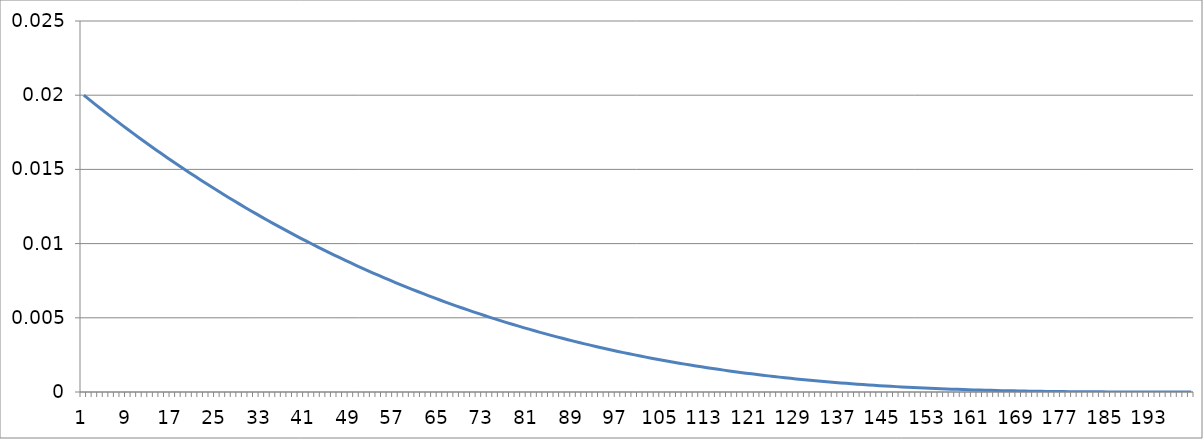
| Category | Series 0 |
|---|---|
| 0 | 0.02 |
| 1 | 0.02 |
| 2 | 0.019 |
| 3 | 0.019 |
| 4 | 0.019 |
| 5 | 0.019 |
| 6 | 0.018 |
| 7 | 0.018 |
| 8 | 0.018 |
| 9 | 0.017 |
| 10 | 0.017 |
| 11 | 0.017 |
| 12 | 0.017 |
| 13 | 0.016 |
| 14 | 0.016 |
| 15 | 0.016 |
| 16 | 0.016 |
| 17 | 0.015 |
| 18 | 0.015 |
| 19 | 0.015 |
| 20 | 0.015 |
| 21 | 0.014 |
| 22 | 0.014 |
| 23 | 0.014 |
| 24 | 0.014 |
| 25 | 0.013 |
| 26 | 0.013 |
| 27 | 0.013 |
| 28 | 0.013 |
| 29 | 0.012 |
| 30 | 0.012 |
| 31 | 0.012 |
| 32 | 0.012 |
| 33 | 0.012 |
| 34 | 0.011 |
| 35 | 0.011 |
| 36 | 0.011 |
| 37 | 0.011 |
| 38 | 0.011 |
| 39 | 0.01 |
| 40 | 0.01 |
| 41 | 0.01 |
| 42 | 0.01 |
| 43 | 0.01 |
| 44 | 0.009 |
| 45 | 0.009 |
| 46 | 0.009 |
| 47 | 0.009 |
| 48 | 0.009 |
| 49 | 0.009 |
| 50 | 0.008 |
| 51 | 0.008 |
| 52 | 0.008 |
| 53 | 0.008 |
| 54 | 0.008 |
| 55 | 0.008 |
| 56 | 0.007 |
| 57 | 0.007 |
| 58 | 0.007 |
| 59 | 0.007 |
| 60 | 0.007 |
| 61 | 0.007 |
| 62 | 0.006 |
| 63 | 0.006 |
| 64 | 0.006 |
| 65 | 0.006 |
| 66 | 0.006 |
| 67 | 0.006 |
| 68 | 0.006 |
| 69 | 0.006 |
| 70 | 0.005 |
| 71 | 0.005 |
| 72 | 0.005 |
| 73 | 0.005 |
| 74 | 0.005 |
| 75 | 0.005 |
| 76 | 0.005 |
| 77 | 0.005 |
| 78 | 0.004 |
| 79 | 0.004 |
| 80 | 0.004 |
| 81 | 0.004 |
| 82 | 0.004 |
| 83 | 0.004 |
| 84 | 0.004 |
| 85 | 0.004 |
| 86 | 0.004 |
| 87 | 0.004 |
| 88 | 0.003 |
| 89 | 0.003 |
| 90 | 0.003 |
| 91 | 0.003 |
| 92 | 0.003 |
| 93 | 0.003 |
| 94 | 0.003 |
| 95 | 0.003 |
| 96 | 0.003 |
| 97 | 0.003 |
| 98 | 0.003 |
| 99 | 0.002 |
| 100 | 0.002 |
| 101 | 0.002 |
| 102 | 0.002 |
| 103 | 0.002 |
| 104 | 0.002 |
| 105 | 0.002 |
| 106 | 0.002 |
| 107 | 0.002 |
| 108 | 0.002 |
| 109 | 0.002 |
| 110 | 0.002 |
| 111 | 0.002 |
| 112 | 0.002 |
| 113 | 0.002 |
| 114 | 0.002 |
| 115 | 0.001 |
| 116 | 0.001 |
| 117 | 0.001 |
| 118 | 0.001 |
| 119 | 0.001 |
| 120 | 0.001 |
| 121 | 0.001 |
| 122 | 0.001 |
| 123 | 0.001 |
| 124 | 0.001 |
| 125 | 0.001 |
| 126 | 0.001 |
| 127 | 0.001 |
| 128 | 0.001 |
| 129 | 0.001 |
| 130 | 0.001 |
| 131 | 0.001 |
| 132 | 0.001 |
| 133 | 0.001 |
| 134 | 0.001 |
| 135 | 0.001 |
| 136 | 0.001 |
| 137 | 0.001 |
| 138 | 0.001 |
| 139 | 0.001 |
| 140 | 0.001 |
| 141 | 0 |
| 142 | 0 |
| 143 | 0 |
| 144 | 0 |
| 145 | 0 |
| 146 | 0 |
| 147 | 0 |
| 148 | 0 |
| 149 | 0 |
| 150 | 0 |
| 151 | 0 |
| 152 | 0 |
| 153 | 0 |
| 154 | 0 |
| 155 | 0 |
| 156 | 0 |
| 157 | 0 |
| 158 | 0 |
| 159 | 0 |
| 160 | 0 |
| 161 | 0 |
| 162 | 0 |
| 163 | 0 |
| 164 | 0 |
| 165 | 0 |
| 166 | 0 |
| 167 | 0 |
| 168 | 0 |
| 169 | 0 |
| 170 | 0 |
| 171 | 0 |
| 172 | 0 |
| 173 | 0 |
| 174 | 0 |
| 175 | 0 |
| 176 | 0 |
| 177 | 0 |
| 178 | 0 |
| 179 | 0 |
| 180 | 0 |
| 181 | 0 |
| 182 | 0 |
| 183 | 0 |
| 184 | 0 |
| 185 | 0 |
| 186 | 0 |
| 187 | 0 |
| 188 | 0 |
| 189 | 0 |
| 190 | 0 |
| 191 | 0 |
| 192 | 0 |
| 193 | 0 |
| 194 | 0 |
| 195 | 0 |
| 196 | 0 |
| 197 | 0 |
| 198 | 0 |
| 199 | 0 |